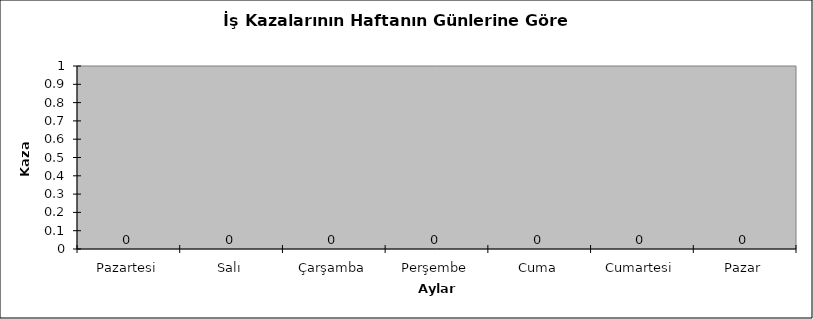
| Category | Series 1 |
|---|---|
| Pazartesi | 0 |
| Salı | 0 |
| Çarşamba | 0 |
| Perşembe | 0 |
| Cuma | 0 |
| Cumartesi | 0 |
| Pazar | 0 |